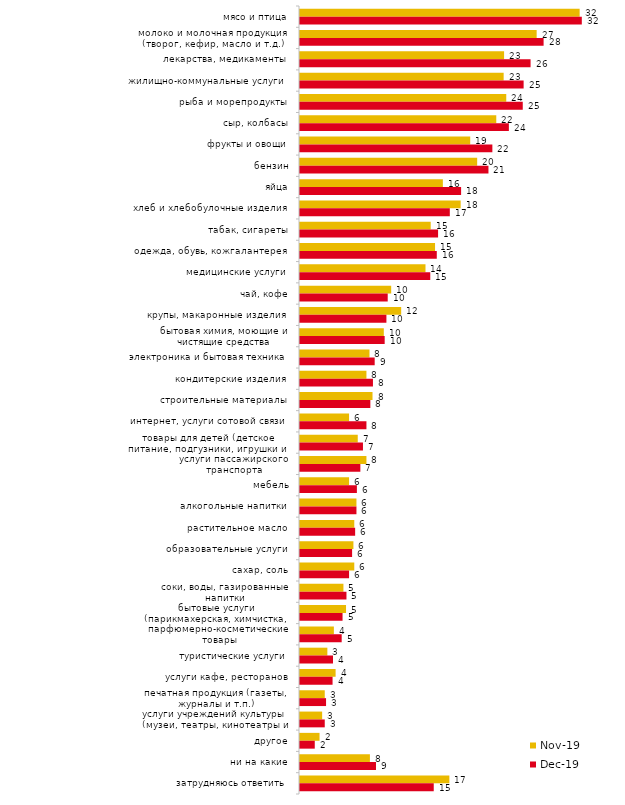
| Category | ноя.19 | дек.19 |
|---|---|---|
| мясо и птица | 31.881 | 32.129 |
| молоко и молочная продукция (творог, кефир, масло и т.д.) | 26.98 | 27.772 |
| лекарства, медикаменты | 23.267 | 26.287 |
| жилищно-коммунальные услуги | 23.218 | 25.495 |
| рыба и морепродукты | 23.515 | 25.396 |
| сыр, колбасы | 22.376 | 23.812 |
| фрукты и овощи | 19.406 | 21.931 |
| бензин | 20.198 | 21.485 |
| яйца | 16.287 | 18.366 |
| хлеб и хлебобулочные изделия | 18.317 | 17.079 |
| табак, сигареты | 14.901 | 15.743 |
| одежда, обувь, кожгалантерея | 15.396 | 15.594 |
| медицинские услуги | 14.307 | 14.851 |
| чай, кофе | 10.396 | 10 |
| крупы, макаронные изделия | 11.535 | 9.851 |
| бытовая химия, моющие и чистящие средства | 9.554 | 9.653 |
| электроника и бытовая техника | 7.921 | 8.515 |
| кондитерские изделия | 7.574 | 8.317 |
| строительные материалы | 8.267 | 8.02 |
| интернет, услуги сотовой связи | 5.594 | 7.574 |
| товары для детей (детское питание, подгузники, игрушки и т.п.) | 6.584 | 7.178 |
| услуги пассажирского транспорта | 7.574 | 6.881 |
| мебель | 5.594 | 6.485 |
| алкогольные напитки | 6.436 | 6.436 |
| растительное масло | 6.188 | 6.287 |
| образовательные услуги | 6.089 | 5.941 |
| сахар, соль | 6.188 | 5.594 |
| соки, воды, газированные напитки | 4.95 | 5.297 |
| бытовые услуги (парикмахерская, химчистка, ателье и т.д.) | 5.248 | 4.851 |
| парфюмерно-косметические товары | 3.861 | 4.752 |
| туристические услуги | 3.119 | 3.762 |
| услуги кафе, ресторанов | 4.059 | 3.713 |
| печатная продукция (газеты, журналы и т.п.) | 2.822 | 2.97 |
| услуги учреждений культуры (музеи, театры, кинотеатры и т.п.) | 2.525 | 2.822 |
| другое | 2.228 | 1.683 |
| ни на какие | 7.97 | 8.663 |
| затрудняюсь ответить | 17.03 | 15.248 |